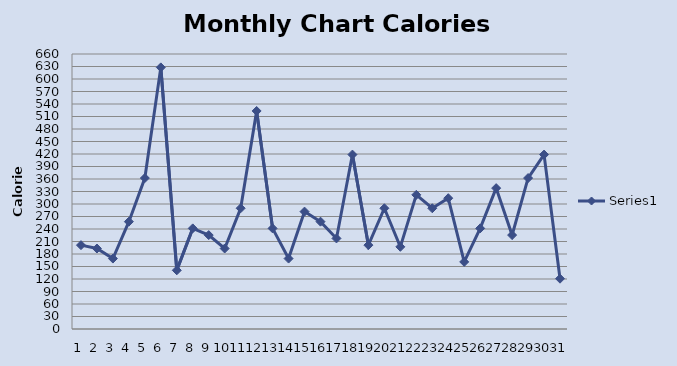
| Category | Series 0 |
|---|---|
| 0 | 201.25 |
| 1900-01-01 | 193.2 |
| 1900-01-02 | 169.05 |
| 1900-01-03 | 257.6 |
| 1900-01-04 | 362.25 |
| 1900-01-05 | 627.9 |
| 1900-01-06 | 140.875 |
| 1900-01-07 | 241.5 |
| 1900-01-08 | 225.4 |
| 1900-01-09 | 193.2 |
| 1900-01-10 | 289.8 |
| 1900-01-11 | 523.25 |
| 1900-01-12 | 241.5 |
| 1900-01-13 | 169.05 |
| 1900-01-14 | 281.75 |
| 1900-01-15 | 257.6 |
| 1900-01-16 | 217.35 |
| 1900-01-17 | 418.6 |
| 1900-01-18 | 201.25 |
| 1900-01-19 | 289.8 |
| 1900-01-20 | 197.225 |
| 1900-01-21 | 322 |
| 1900-01-22 | 289.8 |
| 1900-01-23 | 313.95 |
| 1900-01-24 | 161 |
| 1900-01-25 | 241.5 |
| 1900-01-26 | 338.1 |
| 1900-01-27 | 225.4 |
| 1900-01-28 | 362.25 |
| 1900-01-29 | 418.6 |
| 1900-01-30 | 120.75 |